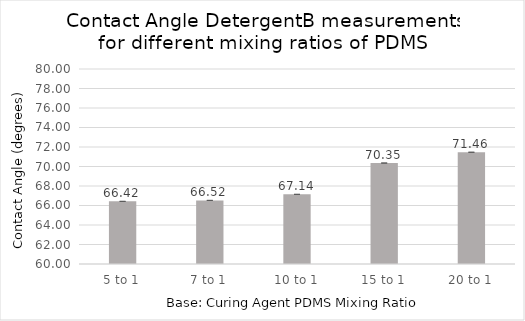
| Category | Series 0 |
|---|---|
| 5 to 1 | 66.423 |
| 7 to 1 | 66.523 |
| 10 to 1 | 67.143 |
| 15 to 1 | 70.353 |
| 20 to 1 | 71.46 |